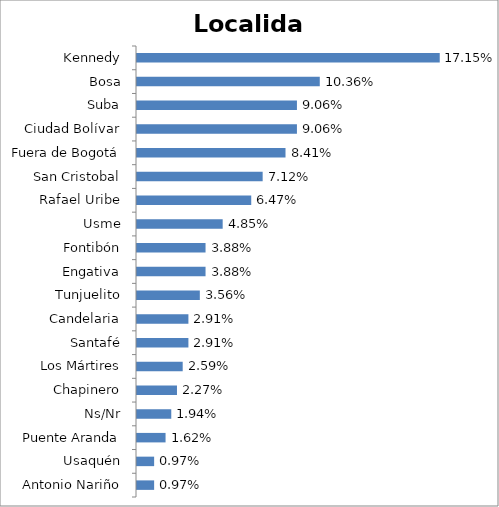
| Category | Total |
|---|---|
| Antonio Nariño | 0.01 |
| Usaquén | 0.01 |
| Puente Aranda | 0.016 |
| Ns/Nr | 0.019 |
| Chapinero | 0.023 |
| Los Mártires | 0.026 |
| Santafé | 0.029 |
| Candelaria | 0.029 |
| Tunjuelito | 0.036 |
| Engativa | 0.039 |
| Fontibón | 0.039 |
| Usme | 0.049 |
| Rafael Uribe | 0.065 |
| San Cristobal | 0.071 |
| Fuera de Bogotá | 0.084 |
| Ciudad Bolívar | 0.091 |
| Suba | 0.091 |
| Bosa | 0.104 |
| Kennedy | 0.172 |